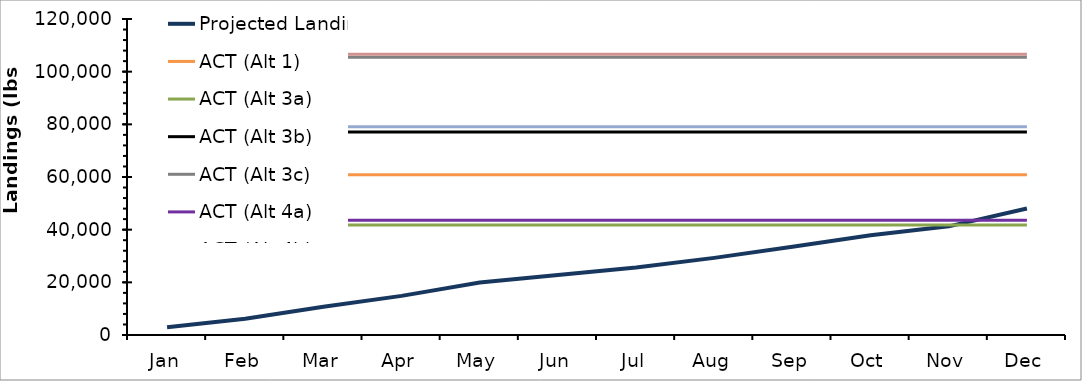
| Category | Projected Landings | ACT (Alt 1) | ACT (Alt 3a) | ACT (Alt 3b) | ACT (Alt 3c) | ACT (Alt 4a) | ACT (Alt 4b) | ACT (Alt 4c) |
|---|---|---|---|---|---|---|---|---|
| Jan | 2962.5 | 60900 | 41731 | 77087 | 105487 | 43534 | 79083 | 106582 |
| Feb | 6139.5 | 60900 | 41731 | 77087 | 105487 | 43534 | 79083 | 106582 |
| Mar | 10749.5 | 60900 | 41731 | 77087 | 105487 | 43534 | 79083 | 106582 |
| Apr | 14854 | 60900 | 41731 | 77087 | 105487 | 43534 | 79083 | 106582 |
| May | 19915 | 60900 | 41731 | 77087 | 105487 | 43534 | 79083 | 106582 |
| Jun | 22789.049 | 60900 | 41731 | 77087 | 105487 | 43534 | 79083 | 106582 |
| Jul | 25623.287 | 60900 | 41731 | 77087 | 105487 | 43534 | 79083 | 106582 |
| Aug | 29283.287 | 60900 | 41731 | 77087 | 105487 | 43534 | 79083 | 106582 |
| Sep | 33544.953 | 60900 | 41731 | 77087 | 105487 | 43534 | 79083 | 106582 |
| Oct | 37876.62 | 60900 | 41731 | 77087 | 105487 | 43534 | 79083 | 106582 |
| Nov | 41265.62 | 60900 | 41731 | 77087 | 105487 | 43534 | 79083 | 106582 |
| Dec | 48024.287 | 60900 | 41731 | 77087 | 105487 | 43534 | 79083 | 106582 |